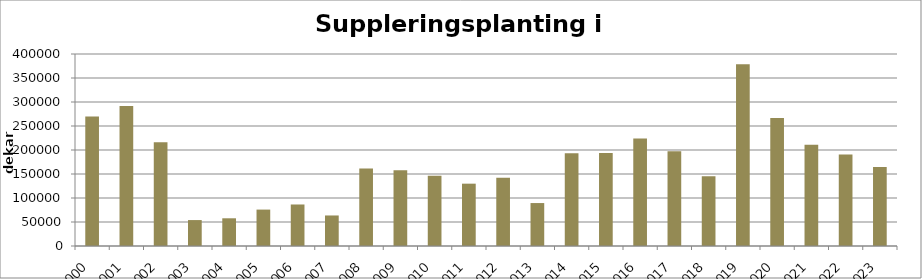
| Category | Totalt |
|---|---|
| 2000 | 269930 |
| 2001 | 291906 |
| 2002 | 215920 |
| 2003 | 54031 |
| 2004 | 57735 |
| 2005 | 75861 |
| 2006 | 86495 |
| 2007 | 63610 |
| 2008 | 161415 |
| 2009 | 157780 |
| 2010 | 146294 |
| 2011 | 129865 |
| 2012 | 141975 |
| 2013 | 89470 |
| 2014 | 193035 |
| 2015 | 193690 |
| 2016 | 224175 |
| 2017 | 197545 |
| 2018 | 145130 |
| 2019 | 378525 |
| 2020 | 266651 |
| 2021 | 211095 |
| 2022 | 190485 |
| 2023 | 164420 |